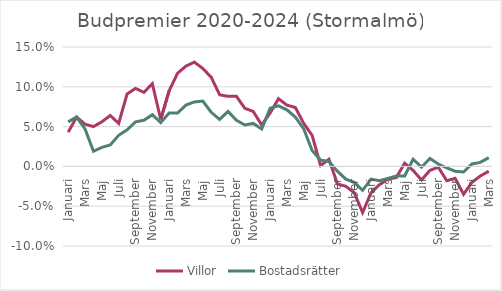
| Category | Villor | Bostadsrätter |
|---|---|---|
| Januari | 0.043 | 0.056 |
| Februari | 0.062 | 0.062 |
| Mars | 0.053 | 0.047 |
| April | 0.05 | 0.019 |
| Maj | 0.056 | 0.024 |
| Juni | 0.064 | 0.027 |
| Juli | 0.054 | 0.039 |
| Augusti | 0.091 | 0.046 |
| September | 0.098 | 0.056 |
| Oktober | 0.093 | 0.058 |
| November | 0.104 | 0.065 |
| December | 0.059 | 0.055 |
| Januari | 0.095 | 0.067 |
| Februari | 0.117 | 0.067 |
| Mars | 0.126 | 0.077 |
| April | 0.131 | 0.081 |
| Maj | 0.123 | 0.082 |
| Juni | 0.112 | 0.068 |
| Juli | 0.09 | 0.059 |
| Augusti | 0.088 | 0.069 |
| September | 0.088 | 0.058 |
| Oktober | 0.073 | 0.052 |
| November | 0.069 | 0.054 |
| December | 0.052 | 0.047 |
| Januari | 0.067 | 0.073 |
| Februari | 0.085 | 0.076 |
| Mars | 0.077 | 0.071 |
| April | 0.074 | 0.062 |
| Maj | 0.054 | 0.047 |
| Juni | 0.039 | 0.02 |
| Juli | 0.001 | 0.008 |
| Augusti | 0.009 | 0.006 |
| September | -0.022 | -0.006 |
| Oktober | -0.025 | -0.016 |
| November | -0.033 | -0.02 |
| December | -0.058 | -0.03 |
| Januari | -0.033 | -0.016 |
| Februari | -0.023 | -0.018 |
| Mars | -0.016 | -0.015 |
| April | -0.014 | -0.012 |
| Maj | 0.004 | -0.012 |
| Juni | -0.005 | 0.009 |
| Juli | -0.017 | -0.001 |
| Augusti | -0.005 | 0.01 |
| September | -0.001 | 0.003 |
| Oktober | -0.018 | -0.002 |
| November | -0.015 | -0.006 |
| December | -0.035 | -0.007 |
| Januari | -0.02 | 0.003 |
| Februari | -0.012 | 0.005 |
| Mars | -0.006 | 0.011 |